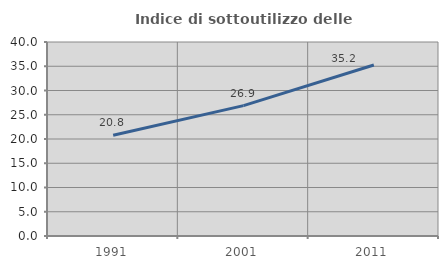
| Category | Indice di sottoutilizzo delle abitazioni  |
|---|---|
| 1991.0 | 20.775 |
| 2001.0 | 26.877 |
| 2011.0 | 35.25 |